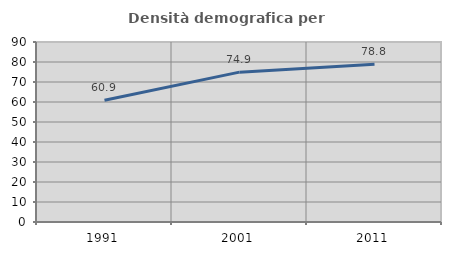
| Category | Densità demografica |
|---|---|
| 1991.0 | 60.885 |
| 2001.0 | 74.926 |
| 2011.0 | 78.819 |